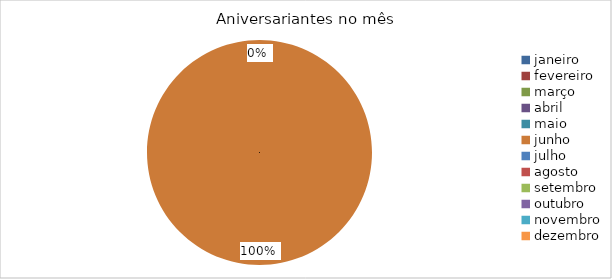
| Category | Aniversariantes no mês |
|---|---|
| janeiro | 0 |
| fevereiro | 0 |
| março | 0 |
| abril | 0 |
| maio | 0 |
| junho | 1 |
| julho | 0 |
| agosto | 0 |
| setembro | 0 |
| outubro | 0 |
| novembro | 0 |
| dezembro | 0 |